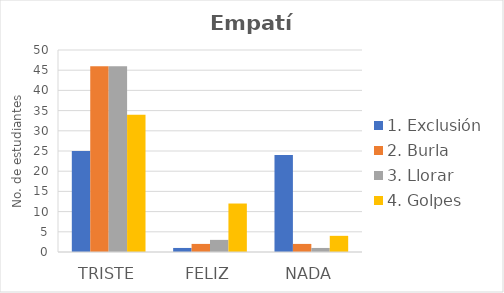
| Category | 1. Exclusión | 2. Burla | 3. Llorar | 4. Golpes |
|---|---|---|---|---|
| Triste | 25 | 46 | 46 | 34 |
| Feliz | 1 | 2 | 3 | 12 |
| Nada | 24 | 2 | 1 | 4 |